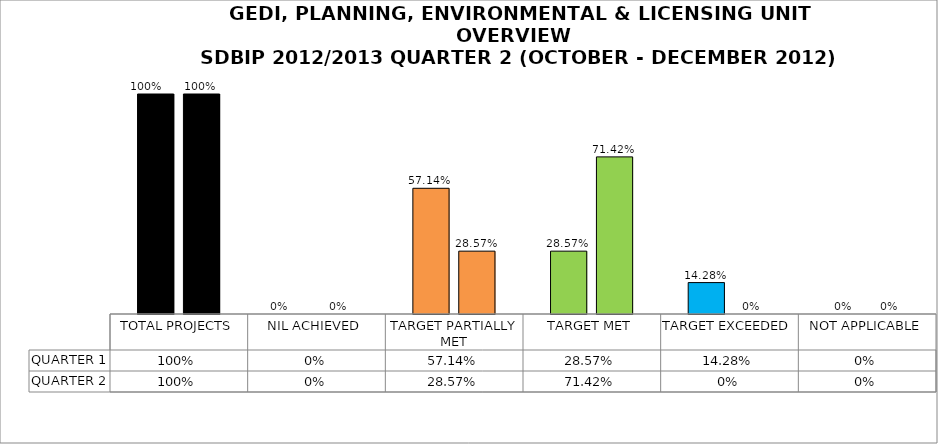
| Category | QUARTER 1  | QUARTER 2 |
|---|---|---|
| TOTAL PROJECTS | 1 | 1 |
| NIL ACHIEVED | 0 | 0 |
| TARGET PARTIALLY MET | 0.571 | 0.286 |
| TARGET MET | 0.286 | 0.714 |
| TARGET EXCEEDED | 0.143 | 0 |
| NOT APPLICABLE | 0 | 0 |